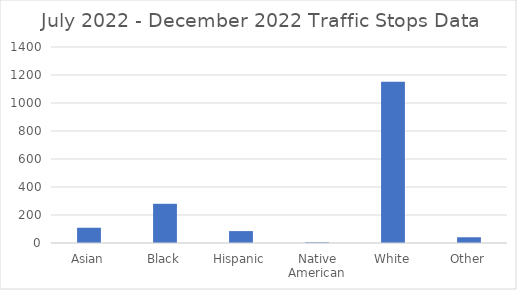
| Category | Series 0 |
|---|---|
| Asian | 109 |
| Black | 280 |
| Hispanic | 85 |
| Native American | 5 |
| White | 1152 |
| Other | 41 |